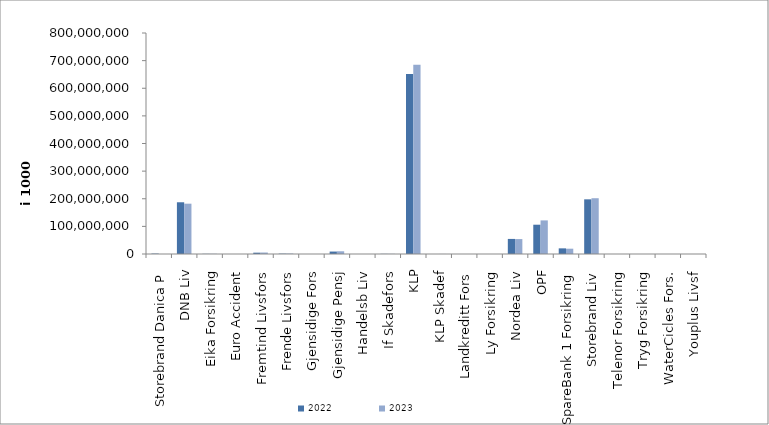
| Category | 2022 | 2023 |
|---|---|---|
| Storebrand Danica P | 1474107.358 | 0 |
| DNB Liv | 187258081.981 | 182150338 |
| Eika Forsikring | 620181 | 689960 |
| Euro Accident | 0 | 0 |
| Fremtind Livsfors | 4825016.001 | 5358000.049 |
| Frende Livsfors | 1264588 | 1571862 |
| Gjensidige Fors | 0 | 0 |
| Gjensidige Pensj | 8842879 | 9863248 |
| Handelsb Liv | 15305 | 0 |
| If Skadefors | 549814.806 | 576634.803 |
| KLP | 651711055.011 | 684665855.728 |
| KLP Skadef | 105413.077 | 135144.105 |
| Landkreditt Fors | 0 | 0 |
| Ly Forsikring | 0 | 0 |
| Nordea Liv | 54578180 | 54065630 |
| OPF | 106050686 | 121634234 |
| SpareBank 1 Forsikring | 20441957 | 19205680.644 |
| Storebrand Liv | 197874814.023 | 201901381.486 |
| Telenor Forsikring | 0 | 0 |
| Tryg Forsikring | 0 | 0 |
| WaterCicles Fors. | 0 | 0 |
| Youplus Livsf | 5826 | 27371 |